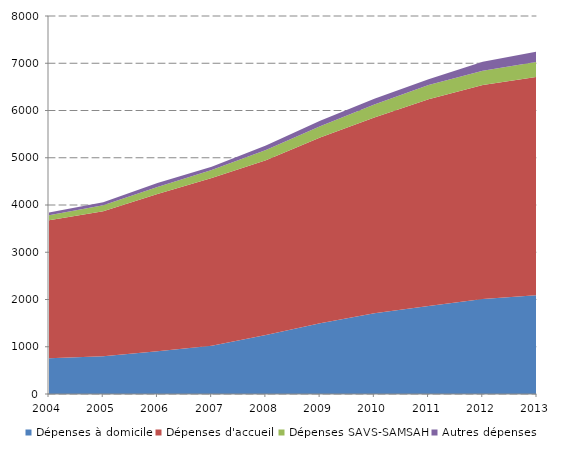
| Category | Dépenses à domicile | Dépenses d'accueil | Dépenses SAVS-SAMSAH | Autres dépenses |
|---|---|---|---|---|
| 2004.0 | 755.535 | 2922.305 | 107.004 | 58.529 |
| 2005.0 | 797.27 | 3070.027 | 129.817 | 59.332 |
| 2006.0 | 905.017 | 3326.255 | 150.316 | 81.669 |
| 2007.0 | 1018.645 | 3550.826 | 169.313 | 72.16 |
| 2008.0 | 1251.258 | 3698.181 | 214.698 | 95.515 |
| 2009.0 | 1496.072 | 3931.077 | 240.677 | 117.503 |
| 2010.0 | 1708.2 | 4141.618 | 274.926 | 125.42 |
| 2011.0 | 1864.29 | 4371.536 | 303.5 | 120.587 |
| 2012.0 | 2008.794 | 4531.758 | 302.646 | 188.205 |
| 2013.0 | 2091.213 | 4623.316 | 315.991 | 219.191 |